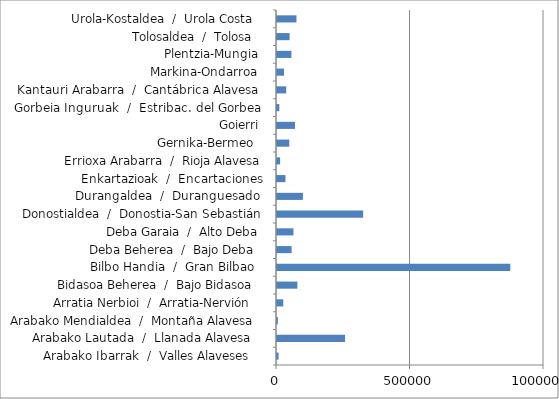
| Category | Habitantes |
|---|---|
| Arabako Ibarrak  /  Valles Alaveses    | 5951 |
| Arabako Lautada  /  Llanada Alavesa    | 254761 |
| Arabako Mendialdea  /  Montaña Alavesa   | 3192 |
| Arratia Nerbioi  /  Arratia-Nervión    | 23499 |
| Bidasoa Beherea  /  Bajo Bidasoa   | 76342 |
| Bilbo Handia  /  Gran Bilbao   | 873742 |
| Deba Beherea  /  Bajo Deba   | 54719 |
| Deba Garaia  /  Alto Deba  | 61668 |
| Donostialdea  /  Donostia-San Sebastián | 322726 |
| Durangaldea  /  Duranguesado  | 97140 |
| Enkartazioak  /  Encartaciones | 31731 |
| Errioxa Arabarra  /  Rioja Alavesa | 11648 |
| Gernika-Bermeo   | 45949 |
| Goierri  | 67383 |
| Gorbeia Inguruak  /  Estribac. del Gorbea  | 8725 |
| Kantauri Arabarra  /  Cantábrica Alavesa  | 34453 |
| Markina-Ondarroa  | 26380 |
| Plentzia-Mungia  | 53965 |
| Tolosaldea  /  Tolosa   | 47129 |
| Urola-Kostaldea  /  Urola Costa   | 72930 |